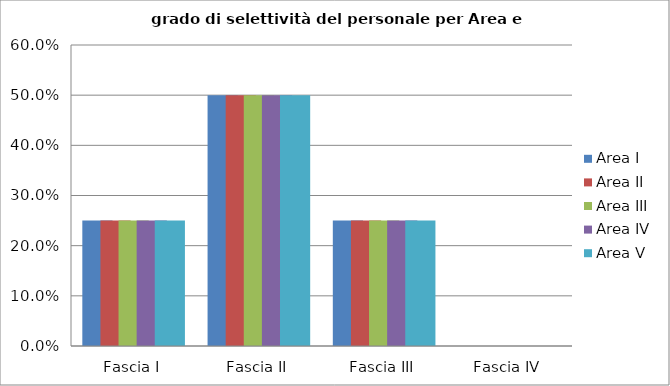
| Category | Area I | Area II | Area III | Area IV | Area V |
|---|---|---|---|---|---|
| Fascia I | 0.25 | 0.25 | 0.25 | 0.25 | 0.25 |
| Fascia II | 0.5 | 0.5 | 0.5 | 0.5 | 0.5 |
| Fascia III | 0.25 | 0.25 | 0.25 | 0.25 | 0.25 |
| Fascia IV | 0 | 0 | 0 | 0 | 0 |